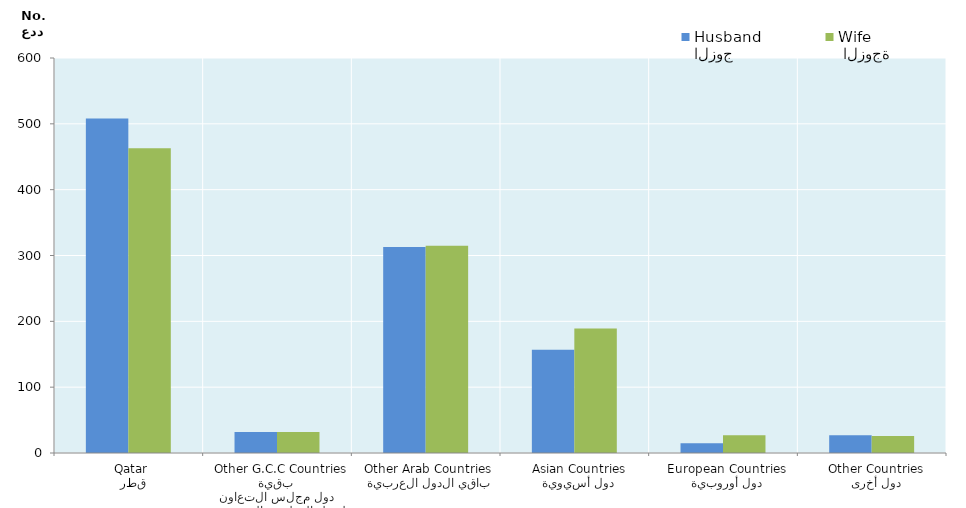
| Category | الزوج
Husband |  الزوجة
Wife |
|---|---|---|
|   قطر
 Qatar | 508 | 463 |
|  بقية دول مجلس التعاون لدول الخليج العربية
  Other G.C.C Countries | 32 | 32 |
|   باقي الدول العربية
 Other Arab Countries | 313 | 315 |
|   دول أسيوية
  Asian Countries | 157 | 189 |
|   دول أوروبية
  European Countries | 15 | 27 |
|   دول أخرى
  Other Countries | 27 | 26 |